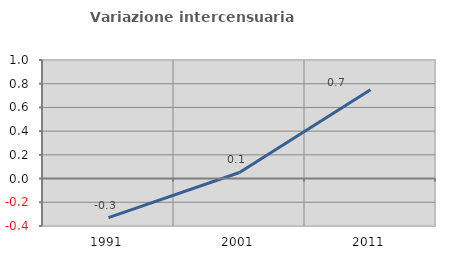
| Category | Variazione intercensuaria annua |
|---|---|
| 1991.0 | -0.329 |
| 2001.0 | 0.051 |
| 2011.0 | 0.75 |